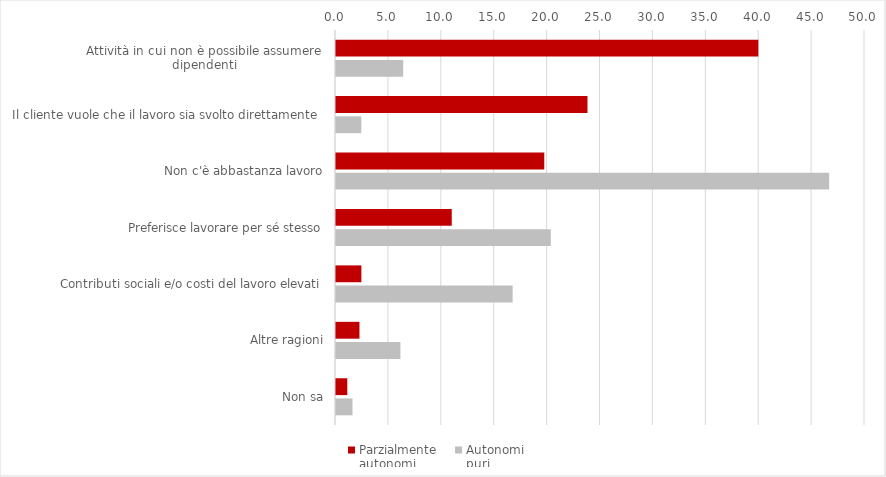
| Category | Parzialmente
autonomi | 1.1
DSE | 1.2
Non
DSE
con
indizi | Autonomi
puri |
|---|---|---|---|---|
| Attività in cui non è possibile assumere
dipendenti | 39.918 |  |  | 6.348 |
| Il cliente vuole che il lavoro sia svolto direttamente  | 23.77 |  |  | 2.392 |
| Non c'è abbastanza lavoro | 19.686 |  |  | 46.614 |
| Preferisce lavorare per sé stesso | 10.941 |  |  | 20.304 |
| Contributi sociali e/o costi del lavoro elevati | 2.399 |  |  | 16.696 |
| Altre ragioni | 2.218 |  |  | 6.089 |
| Non sa | 1.068 |  |  | 1.556 |